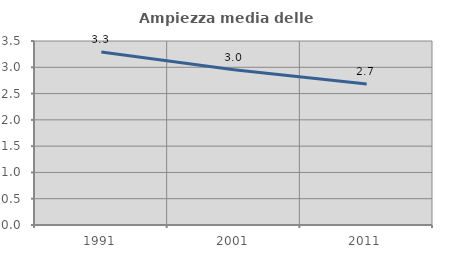
| Category | Ampiezza media delle famiglie |
|---|---|
| 1991.0 | 3.29 |
| 2001.0 | 2.954 |
| 2011.0 | 2.681 |